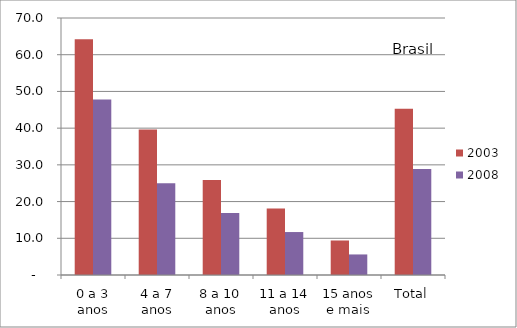
| Category | 2003 | 2008 |
|---|---|---|
| 0 a 3 anos | 64.2 | 47.8 |
| 4 a 7 anos | 39.6 | 25 |
| 8 a 10 anos | 25.9 | 16.9 |
| 11 a 14 anos | 18.1 | 11.7 |
| 15 anos e mais | 9.4 | 5.6 |
| Total | 45.3 | 28.9 |